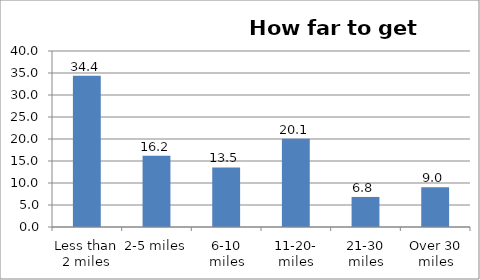
| Category | Series 0 |
|---|---|
| Less than 2 miles | 34.389 |
| 2-5 miles | 16.172 |
| 6-10 miles | 13.538 |
| 11-20- miles | 20.056 |
| 21-30 miles | 6.831 |
| Over 30 miles | 9.013 |